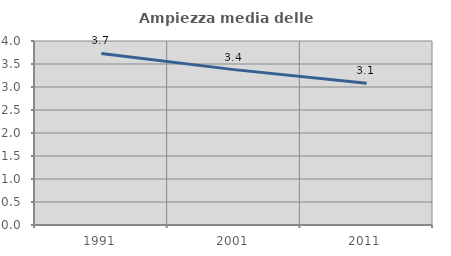
| Category | Ampiezza media delle famiglie |
|---|---|
| 1991.0 | 3.73 |
| 2001.0 | 3.378 |
| 2011.0 | 3.08 |